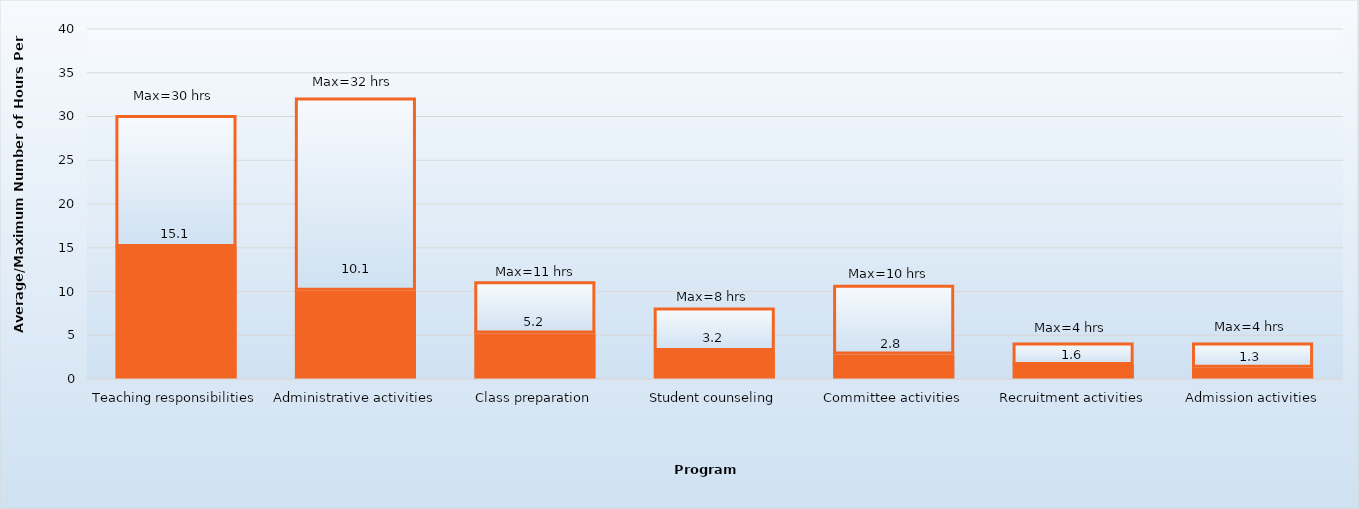
| Category | Average hours per week | Maximum |
|---|---|---|
| Teaching responsibilities | 15.1 | 14.9 |
| Administrative activities | 10.1 | 21.9 |
| Class preparation | 5.2 | 5.8 |
| Student counseling | 3.2 | 4.8 |
| Committee activities | 2.8 | 7.8 |
| Recruitment activities | 1.6 | 2.4 |
| Admission activities | 1.3 | 2.7 |